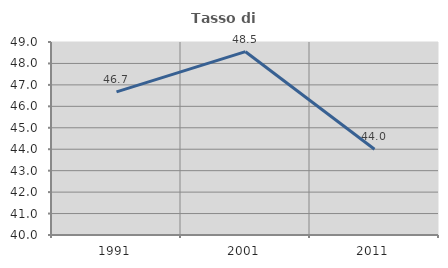
| Category | Tasso di occupazione   |
|---|---|
| 1991.0 | 46.671 |
| 2001.0 | 48.548 |
| 2011.0 | 43.997 |